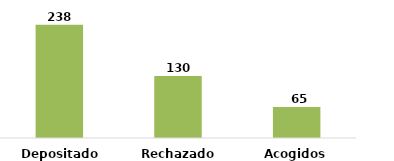
| Category | Series 0 |
|---|---|
| Depositados | 238 |
| Rechazados | 130 |
| Acogidos | 65 |